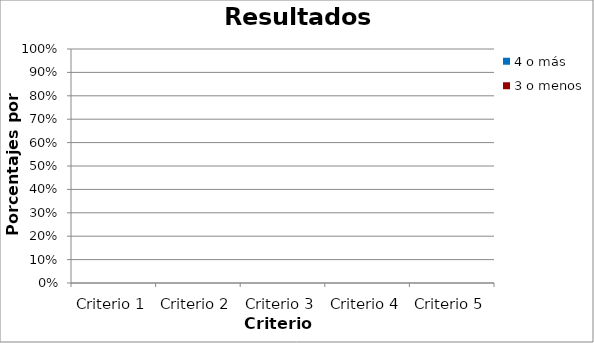
| Category | 4 o más | 3 o menos |
|---|---|---|
| Criterio 1 | 0 | 0 |
| Criterio 2 | 0 | 0 |
| Criterio 3 | 0 | 0 |
| Criterio 4 | 0 | 0 |
| Criterio 5 | 0 | 0 |